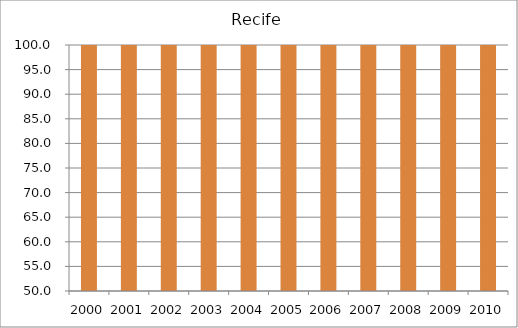
| Category | Recife |
|---|---|
| 2000.0 | 121.02 |
| 2001.0 | 114.4 |
| 2002.0 | 116.02 |
| 2003.0 | 127.37 |
| 2004.0 | 115.64 |
| 2005.0 | 111.66 |
| 2006.0 | 107.53 |
| 2007.0 | 110.53 |
| 2008.0 | 107.29 |
| 2009.0 | 111.49 |
| 2010.0 | 105.2 |